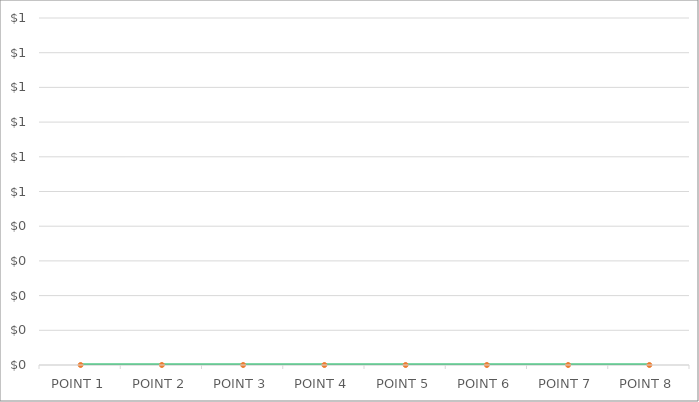
| Category | Series 1 |
|---|---|
| POINT 1 | 0 |
| POINT 2 | 0 |
| POINT 3 | 0 |
| POINT 4 | 0 |
| POINT 5 | 0 |
| POINT 6 | 0 |
| POINT 7 | 0 |
| POINT 8 | 0 |